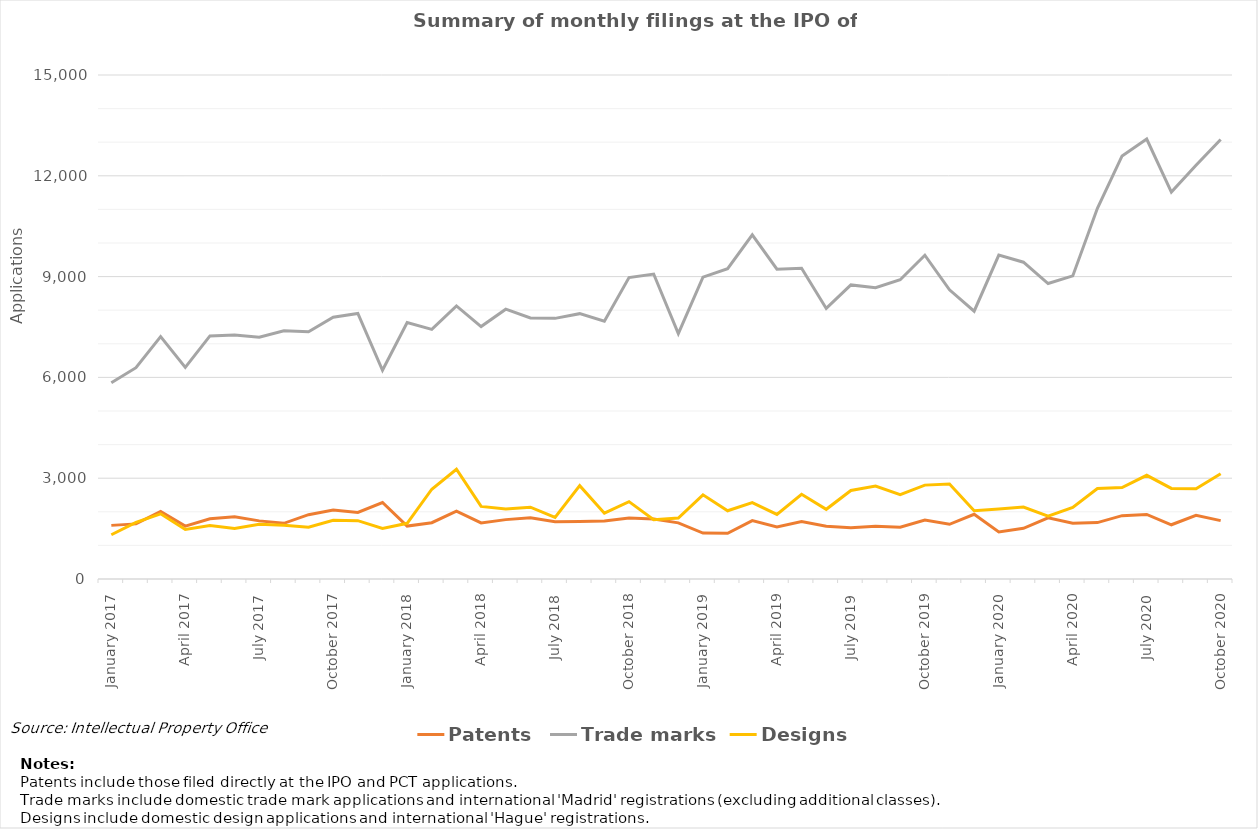
| Category | Patents | Trade marks | Designs |
|---|---|---|---|
| January 2017 | 1596 | 5843 | 1318 |
| February 2017 | 1640 | 6288 | 1687 |
| March 2017 | 2011 | 7214 | 1940 |
| April 2017 | 1573 | 6297 | 1474 |
| May 2017 | 1790 | 7234 | 1592 |
| June 2017 | 1853 | 7263 | 1502 |
| July 2017 | 1730 | 7197 | 1627 |
| August 2017 | 1657 | 7389 | 1600 |
| September 2017 | 1915 | 7359 | 1544 |
| October 2017 | 2055 | 7792 | 1745 |
| November 2017 | 1983 | 7901 | 1736 |
| December 2017 | 2277 | 6211 | 1507 |
| January 2018 | 1575 | 7634 | 1658 |
| February 2018 | 1676 | 7428 | 2672 |
| March 2018 | 2022 | 8127 | 3267 |
| April 2018 | 1670 | 7512 | 2160 |
| May 2018 | 1767 | 8030 | 2083 |
| June 2018 | 1821 | 7769 | 2136 |
| July 2018 | 1704 | 7757 | 1832 |
| August 2018 | 1713 | 7897 | 2777 |
| September 2018 | 1725 | 7673 | 1960 |
| October 2018 | 1818 | 8972 | 2302 |
| November 2018 | 1787 | 9076 | 1765 |
| December 2018 | 1670 | 7304 | 1815 |
| January 2019 | 1367 | 8983 | 2505 |
| February 2019 | 1361 | 9234 | 2031 |
| March 2019 | 1737 | 10244 | 2275 |
| April 2019 | 1552 | 9219 | 1923 |
| May 2019 | 1710 | 9251 | 2520 |
| June 2019 | 1570 | 8053 | 2074 |
| July 2019 | 1527 | 8752 | 2634 |
| August 2019 | 1572 | 8670 | 2768 |
| September 2019 | 1540 | 8907 | 2511 |
| October 2019 | 1755 | 9636 | 2794 |
| November 2019 | 1629 | 8607 | 2827 |
| December 2019 | 1927 | 7970 | 2034 |
| January 2020 | 1400 | 9642 | 2082 |
| February 2020 | 1509 | 9428 | 2143 |
| March 2020 | 1820 | 8794 | 1871 |
| April 2020 | 1658 | 9021 | 2127 |
| May 2020 | 1678 | 11034 | 2694 |
| June 2020 | 1886 | 12590 | 2721 |
| July 2020 | 1921 | 13092 | 3086 |
| August 2020 | 1614 | 11515 | 2695 |
| September 2020 | 1898 | 12311 | 2685 |
| October 2020 | 1738 | 13081 | 3130 |